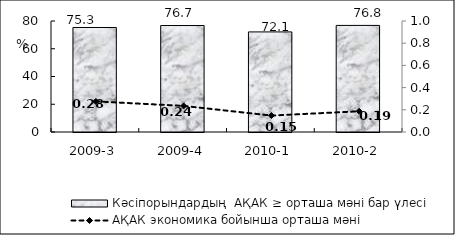
| Category | Кәсіпорындардың  АҚАК ≥ орташа мәні бар үлесі  |
|---|---|
| 2009-3 | 75.32 |
| 2009-4 | 76.74 |
| 2010-1 | 72.13 |
| 2010-2 | 76.82 |